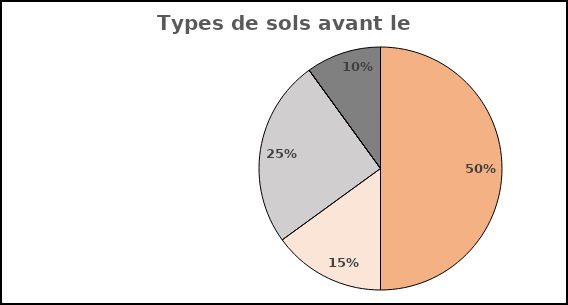
| Category | Series 0 |
|---|---|
| Sols en pleine terre | 50 |
| Sols apparents | 15 |
| Sols revêtus | 25 |
| Toitures végétalisées | 0 |
| Sols bâtis | 10 |